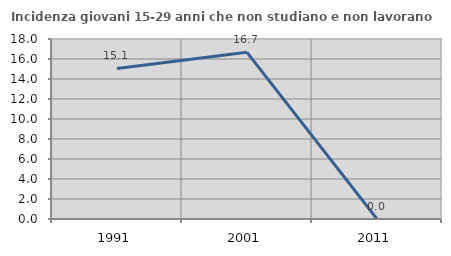
| Category | Incidenza giovani 15-29 anni che non studiano e non lavorano  |
|---|---|
| 1991.0 | 15.06 |
| 2001.0 | 16.667 |
| 2011.0 | 0 |